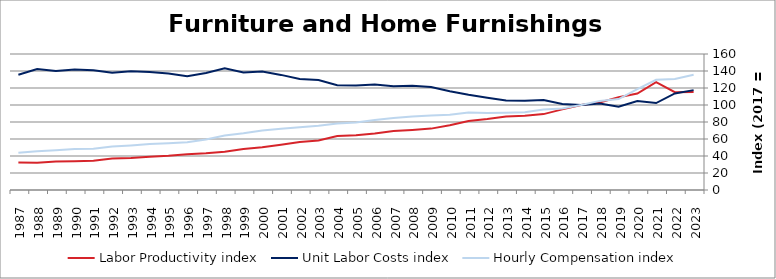
| Category | Labor Productivity index | Unit Labor Costs index | Hourly Compensation index |
|---|---|---|---|
| 2023.0 | 115.34 | 117.491 | 135.514 |
| 2022.0 | 115.039 | 113.579 | 130.66 |
| 2021.0 | 126.804 | 102.264 | 129.676 |
| 2020.0 | 113.445 | 104.563 | 118.621 |
| 2019.0 | 109.222 | 97.969 | 107.004 |
| 2018.0 | 102.984 | 101.79 | 104.827 |
| 2017.0 | 100 | 100 | 100 |
| 2016.0 | 94.828 | 101.067 | 95.84 |
| 2015.0 | 89.283 | 105.918 | 94.566 |
| 2014.0 | 87.298 | 104.89 | 91.567 |
| 2013.0 | 86.483 | 105.195 | 90.976 |
| 2012.0 | 83.498 | 108.649 | 90.72 |
| 2011.0 | 81.229 | 112.184 | 91.126 |
| 2010.0 | 76.088 | 116.288 | 88.482 |
| 2009.0 | 72.212 | 121.247 | 87.555 |
| 2008.0 | 70.559 | 122.604 | 86.508 |
| 2007.0 | 69.335 | 122.019 | 84.602 |
| 2006.0 | 66.348 | 124.152 | 82.372 |
| 2005.0 | 64.482 | 122.963 | 79.289 |
| 2004.0 | 63.445 | 123.209 | 78.17 |
| 2003.0 | 58.365 | 129.465 | 75.562 |
| 2002.0 | 56.52 | 130.659 | 73.848 |
| 2001.0 | 53.122 | 135.418 | 71.937 |
| 2000.0 | 50.167 | 139.333 | 69.898 |
| 1999.0 | 48.205 | 138.34 | 66.687 |
| 1998.0 | 44.872 | 143.147 | 64.233 |
| 1997.0 | 43.111 | 137.667 | 59.35 |
| 1996.0 | 41.928 | 133.786 | 56.094 |
| 1995.0 | 40.173 | 136.955 | 55.019 |
| 1994.0 | 38.973 | 138.828 | 54.106 |
| 1993.0 | 37.507 | 139.702 | 52.398 |
| 1992.0 | 37.113 | 137.843 | 51.157 |
| 1991.0 | 34.514 | 140.876 | 48.621 |
| 1990.0 | 33.921 | 141.825 | 48.109 |
| 1989.0 | 33.448 | 139.935 | 46.805 |
| 1988.0 | 32.05 | 142.328 | 45.616 |
| 1987.0 | 32.261 | 135.517 | 43.719 |